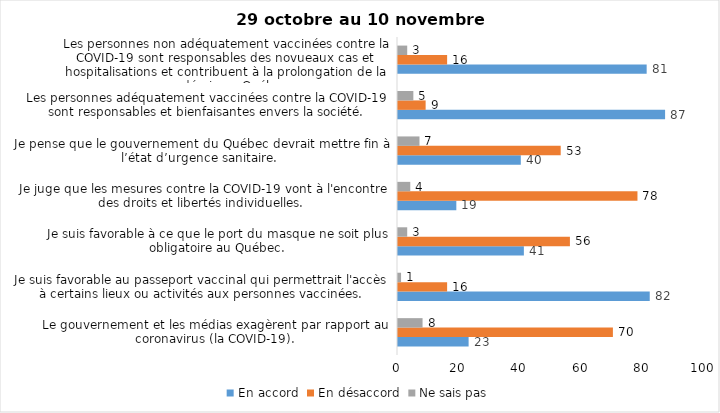
| Category | En accord | En désaccord | Ne sais pas |
|---|---|---|---|
| Le gouvernement et les médias exagèrent par rapport au coronavirus (la COVID-19). | 23 | 70 | 8 |
| Je suis favorable au passeport vaccinal qui permettrait l'accès à certains lieux ou activités aux personnes vaccinées. | 82 | 16 | 1 |
| Je suis favorable à ce que le port du masque ne soit plus obligatoire au Québec. | 41 | 56 | 3 |
| Je juge que les mesures contre la COVID-19 vont à l'encontre des droits et libertés individuelles.  | 19 | 78 | 4 |
| Je pense que le gouvernement du Québec devrait mettre fin à l’état d’urgence sanitaire.  | 40 | 53 | 7 |
| Les personnes adéquatement vaccinées contre la COVID-19 sont responsables et bienfaisantes envers la société. | 87 | 9 | 5 |
| Les personnes non adéquatement vaccinées contre la COVID-19 sont responsables des novueaux cas et hospitalisations et contribuent à la prolongation de la pandémie au Québec. | 81 | 16 | 3 |